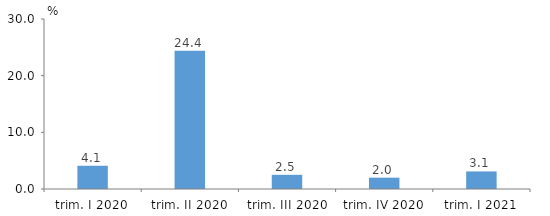
| Category | Series 0 |
|---|---|
| trim. I 2020 | 4.1 |
| trim. II 2020 | 24.4 |
| trim. III 2020 | 2.5 |
| trim. IV 2020 | 2 |
| trim. I 2021 | 3.1 |